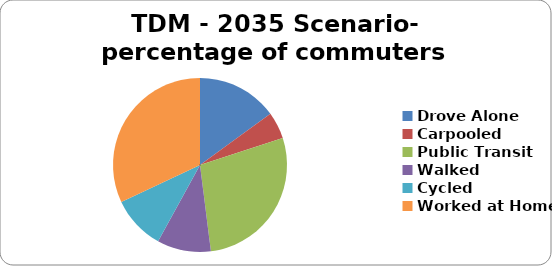
| Category | TDM - 2035 Scenario- percentage of commuters taking this mode |
|---|---|
| Drove Alone | 0.15 |
| Carpooled | 0.05 |
| Public Transit | 0.28 |
| Walked | 0.1 |
| Cycled | 0.1 |
| Worked at Home | 0.32 |